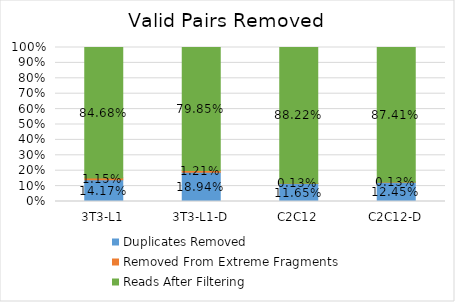
| Category | Duplicates Removed | Removed From Extreme Fragments | Reads After Filtering |
|---|---|---|---|
| 3T3-L1 | 0.142 | 0.011 | 0.847 |
| 3T3-L1-D | 0.189 | 0.012 | 0.798 |
| C2C12 | 0.116 | 0.001 | 0.882 |
| C2C12-D | 0.125 | 0.001 | 0.874 |